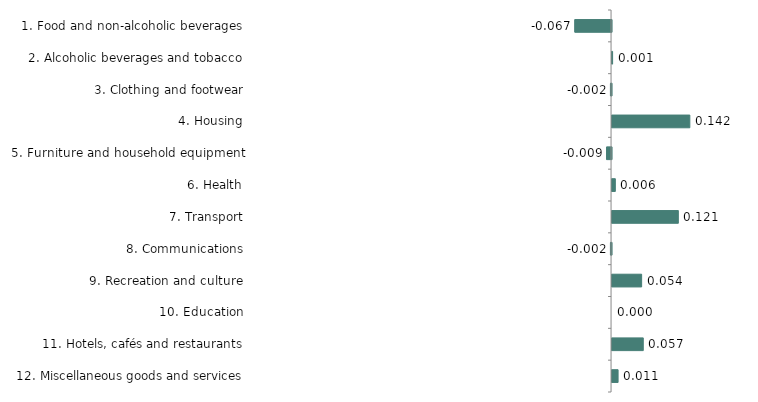
| Category | Series 0 |
|---|---|
| 1. Food and non-alcoholic beverages | -0.067 |
| 2. Alcoholic beverages and tobacco | 0.001 |
| 3. Clothing and footwear | -0.002 |
| 4. Housing | 0.142 |
| 5. Furniture and household equipment | -0.009 |
| 6. Health | 0.006 |
| 7. Transport | 0.121 |
| 8. Communications | -0.002 |
| 9. Recreation and culture | 0.054 |
| 10. Education | 0 |
| 11. Hotels, cafés and restaurants | 0.057 |
| 12. Miscellaneous goods and services | 0.011 |